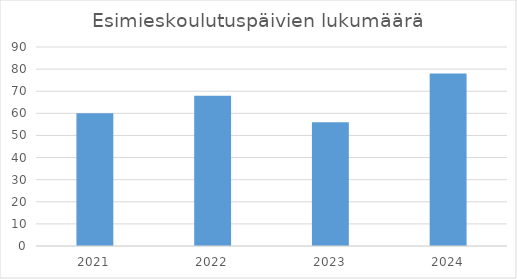
| Category | Esimieskoulutuspäivien lukumäärä |
|---|---|
| 2021.0 | 60 |
| 2022.0 | 68 |
| 2023.0 | 56 |
| 2024.0 | 78 |